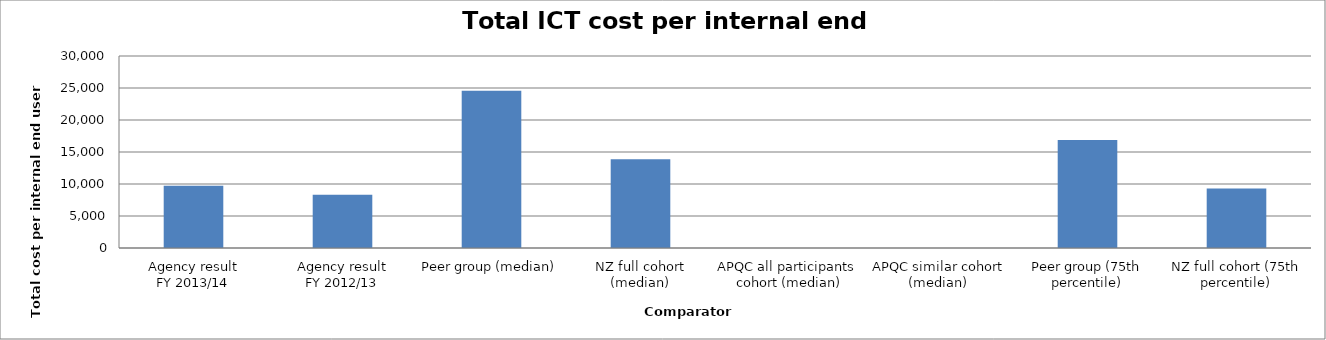
| Category | Result |
|---|---|
| Agency result
FY 2013/14 | 9729.089 |
| Agency result
FY 2012/13 | 8327.911 |
| Peer group (median) | 24554.995 |
| NZ full cohort (median) | 13866.17 |
| APQC all participants 
cohort (median) | 0 |
| APQC similar cohort (median) | 0 |
| Peer group (75th percentile) | 16861.428 |
| NZ full cohort (75th percentile) | 9283.447 |